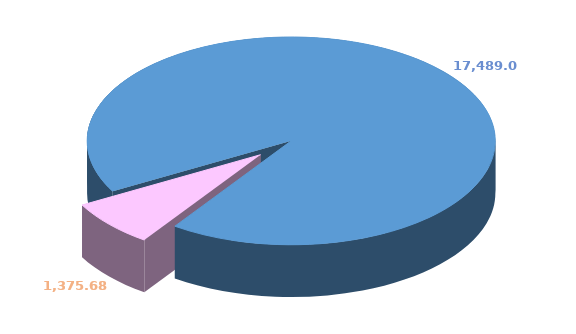
| Category | Series 0 |
|---|---|
| 0 | 17489.013 |
| 1 | 1375.684 |